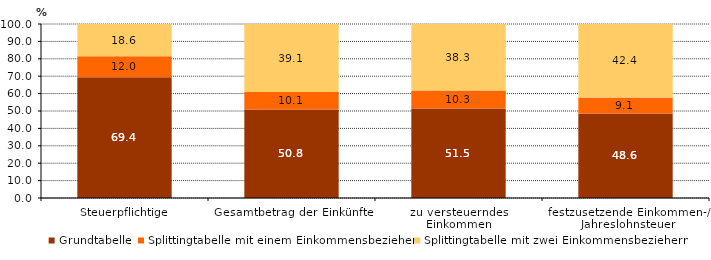
| Category | Grundtabelle | Splittingtabelle mit einem Einkommensbezieher | Splittingtabelle mit zwei Einkommensbeziehern |
|---|---|---|---|
| Steuerpflichtige | 69.4 | 12 | 18.6 |
| Gesamtbetrag der Einkünfte | 50.8 | 10.1 | 39.1 |
| zu versteuerndes 
Einkommen | 51.5 | 10.3 | 38.3 |
| festzusetzende Einkommen-/ Jahreslohnsteuer | 48.6 | 9.1 | 42.4 |